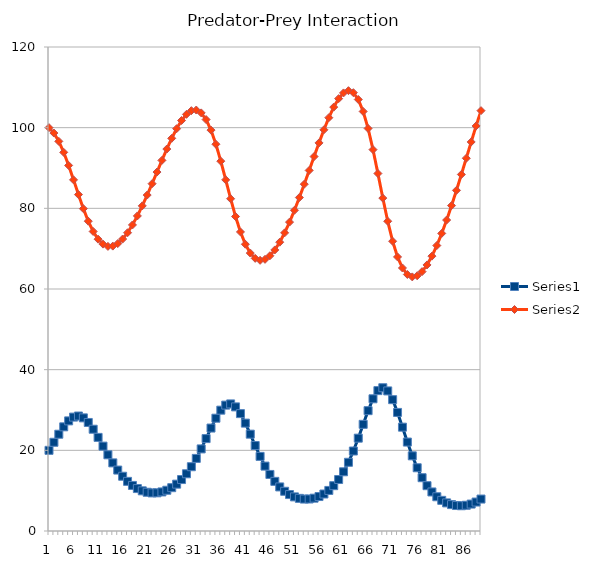
| Category | Series 0 | Series 1 |
|---|---|---|
| 0 | 20 | 100 |
| 1 | 22 | 98.667 |
| 2 | 23.995 | 96.606 |
| 3 | 25.824 | 93.883 |
| 4 | 27.301 | 90.636 |
| 5 | 28.241 | 87.063 |
| 6 | 28.508 | 83.408 |
| 7 | 28.048 | 79.919 |
| 8 | 26.91 | 76.815 |
| 9 | 25.234 | 74.262 |
| 10 | 23.211 | 72.354 |
| 11 | 21.04 | 71.127 |
| 12 | 18.891 | 70.567 |
| 13 | 16.888 | 70.632 |
| 14 | 15.105 | 71.26 |
| 15 | 13.577 | 72.388 |
| 16 | 12.311 | 73.949 |
| 17 | 11.297 | 75.88 |
| 18 | 10.519 | 78.12 |
| 19 | 9.96 | 80.61 |
| 20 | 9.604 | 83.294 |
| 21 | 9.441 | 86.111 |
| 22 | 9.467 | 88.998 |
| 23 | 9.685 | 91.888 |
| 24 | 10.104 | 94.702 |
| 25 | 10.739 | 97.356 |
| 26 | 11.614 | 99.75 |
| 27 | 12.755 | 101.774 |
| 28 | 14.189 | 103.306 |
| 29 | 15.937 | 104.216 |
| 30 | 18.001 | 104.374 |
| 31 | 20.352 | 103.664 |
| 32 | 22.909 | 102.01 |
| 33 | 25.522 | 99.394 |
| 34 | 27.966 | 95.894 |
| 35 | 29.959 | 91.691 |
| 36 | 31.212 | 87.069 |
| 37 | 31.508 | 82.379 |
| 38 | 30.773 | 77.972 |
| 39 | 29.105 | 74.145 |
| 40 | 26.748 | 71.095 |
| 41 | 24.011 | 68.913 |
| 42 | 21.187 | 67.603 |
| 43 | 18.501 | 67.111 |
| 44 | 16.092 | 67.354 |
| 45 | 14.023 | 68.242 |
| 46 | 12.308 | 69.686 |
| 47 | 10.927 | 71.605 |
| 48 | 9.848 | 73.927 |
| 49 | 9.035 | 76.585 |
| 50 | 8.458 | 79.521 |
| 51 | 8.091 | 82.675 |
| 52 | 7.919 | 85.988 |
| 53 | 7.934 | 89.398 |
| 54 | 8.139 | 92.837 |
| 55 | 8.545 | 96.225 |
| 56 | 9.173 | 99.472 |
| 57 | 10.057 | 102.471 |
| 58 | 11.237 | 105.096 |
| 59 | 12.761 | 107.2 |
| 60 | 14.68 | 108.618 |
| 61 | 17.034 | 109.169 |
| 62 | 19.831 | 108.675 |
| 63 | 23.018 | 106.985 |
| 64 | 26.445 | 104.018 |
| 65 | 29.834 | 99.81 |
| 66 | 32.777 | 94.56 |
| 67 | 34.807 | 88.637 |
| 68 | 35.519 | 82.542 |
| 69 | 34.73 | 76.798 |
| 70 | 32.562 | 71.843 |
| 71 | 29.4 | 67.949 |
| 72 | 25.744 | 65.214 |
| 73 | 22.05 | 63.602 |
| 74 | 18.637 | 63.004 |
| 75 | 15.674 | 63.285 |
| 76 | 13.213 | 64.31 |
| 77 | 11.234 | 65.964 |
| 78 | 9.68 | 68.146 |
| 79 | 8.49 | 70.774 |
| 80 | 7.602 | 73.778 |
| 81 | 6.967 | 77.098 |
| 82 | 6.547 | 80.678 |
| 83 | 6.316 | 84.463 |
| 84 | 6.261 | 88.398 |
| 85 | 6.378 | 92.419 |
| 86 | 6.677 | 96.456 |
| 87 | 7.18 | 100.424 |
| 88 | 7.919 | 104.221 |